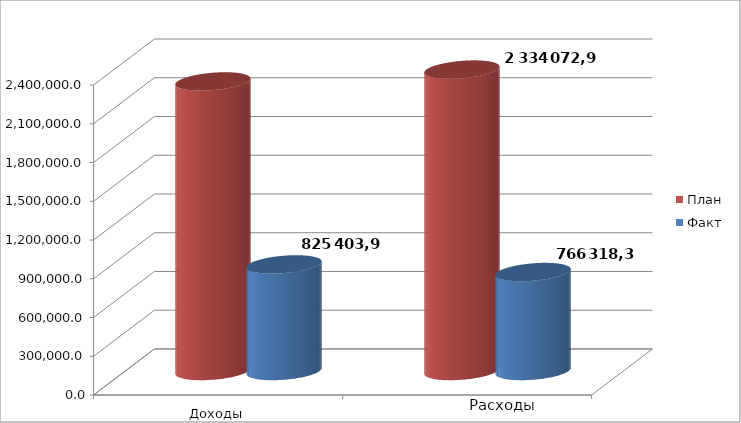
| Category | План | Факт |
|---|---|---|
| 0 | 2242093.3 | 825403.9 |
| 1 | 2334072.9 | 766318.3 |